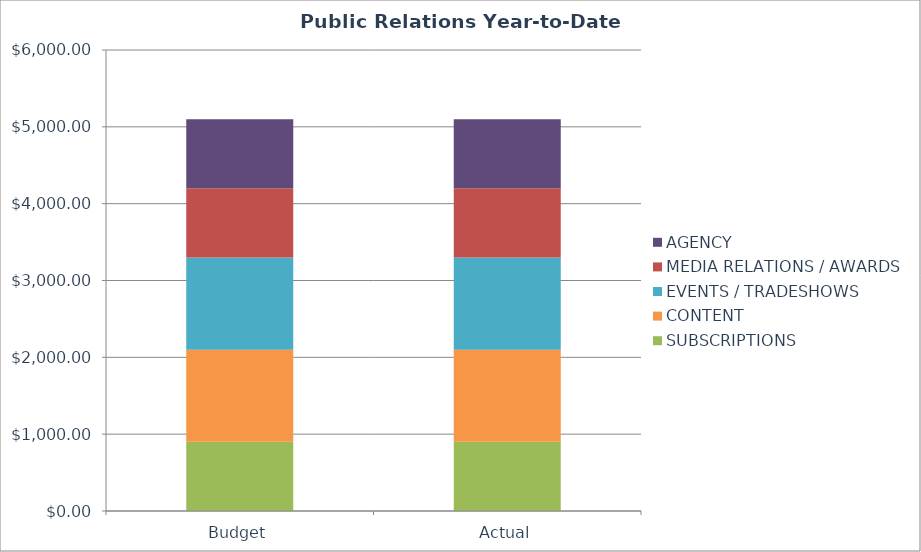
| Category | SUBSCRIPTIONS | CONTENT | EVENTS / TRADESHOWS | MEDIA RELATIONS / AWARDS | AGENCY |
|---|---|---|---|---|---|
| Budget | 900 | 1200 | 1200 | 900 | 900 |
| Actual | 900 | 1200 | 1200 | 900 | 900 |